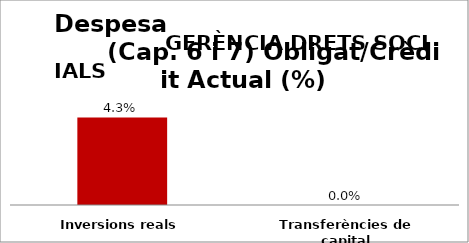
| Category | Series 0 |
|---|---|
| Inversions reals | 0.043 |
| Transferències de capital | 0 |